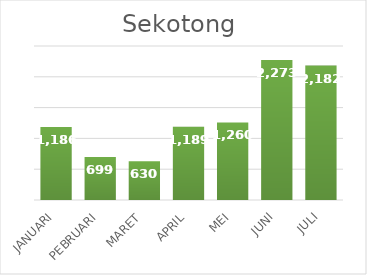
| Category |  1,186  |
|---|---|
| JANUARI | 1186 |
| PEBRUARI | 699 |
| MARET | 630 |
| APRIL | 1189 |
| MEI | 1260 |
| JUNI | 2273 |
| JULI | 2182 |